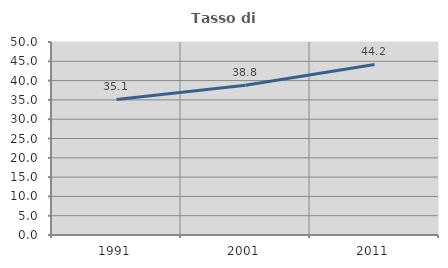
| Category | Tasso di occupazione   |
|---|---|
| 1991.0 | 35.107 |
| 2001.0 | 38.807 |
| 2011.0 | 44.18 |